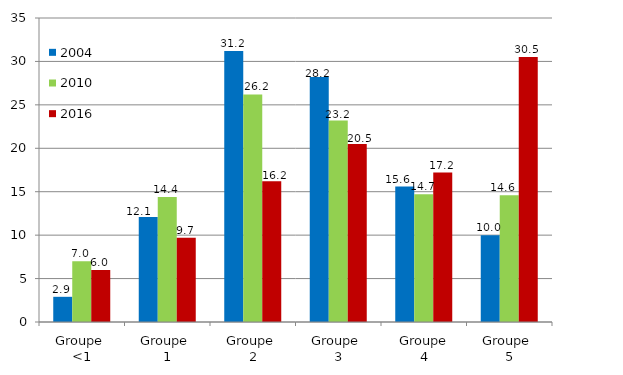
| Category | 2004 | 2010 | 2016 |
|---|---|---|---|
| Groupe 
<1 | 2.9 | 7 | 6 |
| Groupe 
1 | 12.1 | 14.4 | 9.7 |
| Groupe 
2 | 31.2 | 26.2 | 16.2 |
| Groupe 
3 | 28.2 | 23.2 | 20.5 |
| Groupe
4 | 15.6 | 14.7 | 17.2 |
| Groupe 
5 | 10 | 14.6 | 30.5 |